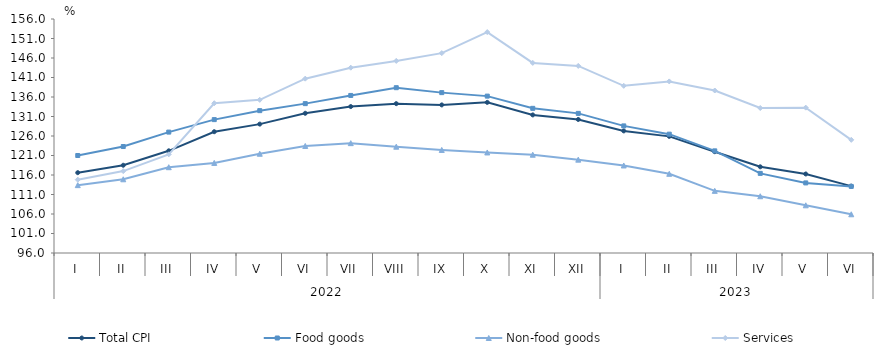
| Category | Total CPI | Food goods | Non-food goods | Services |
|---|---|---|---|---|
| 0 | 116.6 | 121 | 113.4 | 114.8 |
| 1 | 118.5 | 123.3 | 114.9 | 117 |
| 2 | 122.2 | 127 | 118 | 121.3 |
| 3 | 127.1 | 130.2 | 119.1 | 134.4 |
| 4 | 129.047 | 132.5 | 121.45 | 135.267 |
| 5 | 131.827 | 134.301 | 123.443 | 140.701 |
| 6 | 133.547 | 136.399 | 124.168 | 143.511 |
| 7 | 134.294 | 138.387 | 123.256 | 145.253 |
| 8 | 133.971 | 137.121 | 122.424 | 147.248 |
| 9 | 134.625 | 136.226 | 121.779 | 152.646 |
| 10 | 131.406 | 133.093 | 121.201 | 144.742 |
| 11 | 130.241 | 131.801 | 119.936 | 143.965 |
| 12 | 127.307 | 128.59 | 118.441 | 138.865 |
| 13 | 125.905 | 126.472 | 116.307 | 139.99 |
| 14 | 121.977 | 122.19 | 111.932 | 137.666 |
| 15 | 118.102 | 116.414 | 110.554 | 133.178 |
| 16 | 116.262 | 113.97 | 108.228 | 133.268 |
| 17 | 113.152 | 113.076 | 105.931 | 125.017 |